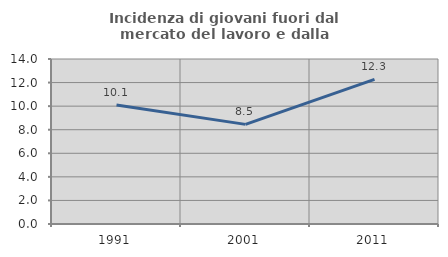
| Category | Incidenza di giovani fuori dal mercato del lavoro e dalla formazione  |
|---|---|
| 1991.0 | 10.102 |
| 2001.0 | 8.454 |
| 2011.0 | 12.274 |